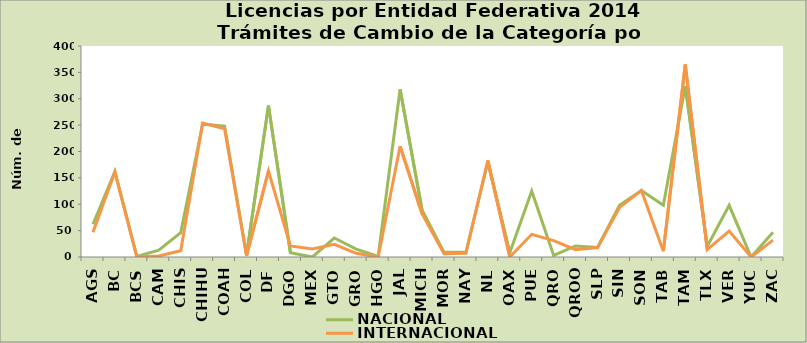
| Category | NACIONAL | INTERNACIONAL |
|---|---|---|
| AGS | 62 | 47 |
| BC | 162 | 161 |
| BCS | 1 | 0 |
| CAM | 13 | 2 |
| CHIS | 46 | 12 |
| CHIHU | 252 | 254 |
| COAH | 248 | 243 |
| COL | 4 | 2 |
| DF | 287 | 163 |
| DGO | 8 | 21 |
| MEX | 0 | 15 |
| GTO | 36 | 24 |
| GRO | 15 | 7 |
| HGO | 1 | 0 |
| JAL | 318 | 210 |
| MICH | 89 | 82 |
| MOR | 9 | 6 |
| NAY | 9 | 7 |
| NL | 180 | 183 |
| OAX | 8 | 0 |
| PUE | 125 | 43 |
| QRO | 3 | 31 |
| QROO | 21 | 14 |
| SLP | 18 | 18 |
| SIN | 98 | 94 |
| SON | 126 | 126 |
| TAB | 98 | 11 |
| TAM | 324 | 365 |
| TLX | 20 | 14 |
| VER | 98 | 49 |
| YUC | 0 | 0 |
| ZAC | 47 | 32 |